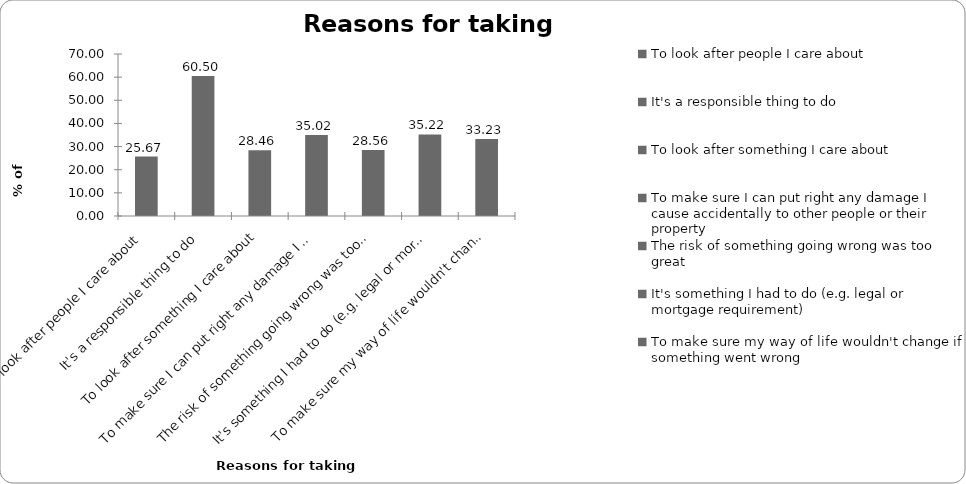
| Category | Reasons for taking insurance |
|---|---|
| To look after people I care about | 25.672 |
| It's a responsible thing to do | 60.498 |
| To look after something I care about | 28.458 |
| To make sure I can put right any damage I cause accidentally to other people or their property | 35.025 |
| The risk of something going wrong was too great | 28.557 |
| It's something I had to do (e.g. legal or mortgage requirement) | 35.224 |
| To make sure my way of life wouldn't change if something went wrong | 33.234 |